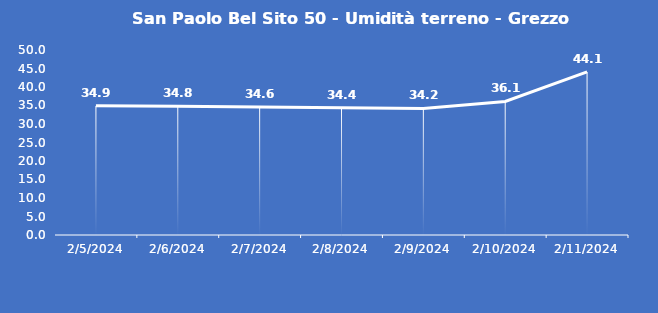
| Category | San Paolo Bel Sito 50 - Umidità terreno - Grezzo (%VWC) |
|---|---|
| 2/5/24 | 34.9 |
| 2/6/24 | 34.8 |
| 2/7/24 | 34.6 |
| 2/8/24 | 34.4 |
| 2/9/24 | 34.2 |
| 2/10/24 | 36.1 |
| 2/11/24 | 44.1 |